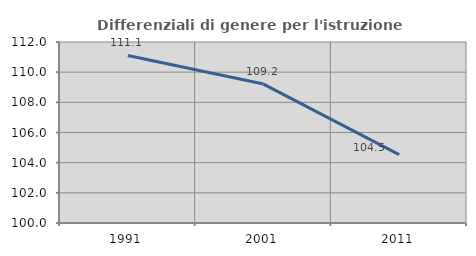
| Category | Differenziali di genere per l'istruzione superiore |
|---|---|
| 1991.0 | 111.108 |
| 2001.0 | 109.211 |
| 2011.0 | 104.538 |